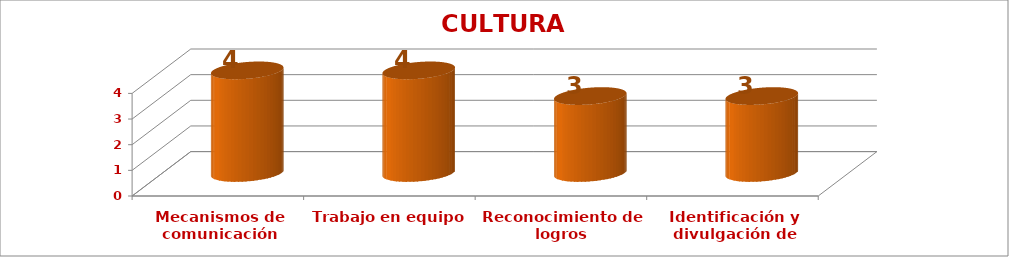
| Category | CULTURA INSTITUCIONAL |
|---|---|
| Mecanismos de comunicación | 4 |
| Trabajo en equipo | 4 |
| Reconocimiento de logros | 3 |
| Identificación y divulgación de buenas prácticas | 3 |